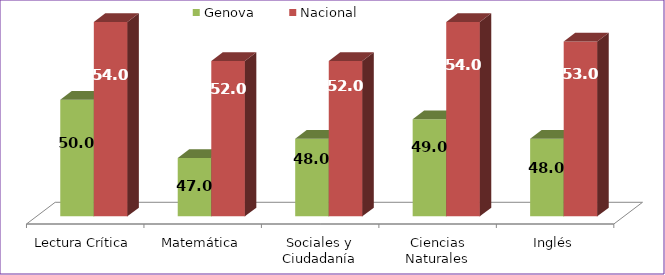
| Category | Genova | Nacional |
|---|---|---|
| Lectura Crítica | 50 | 54 |
| Matemática | 47 | 52 |
| Sociales y Ciudadanía | 48 | 52 |
| Ciencias Naturales | 49 | 54 |
| Inglés | 48 | 53 |